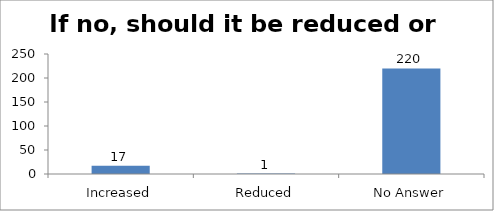
| Category | If no, should it be reduced or increased |
|---|---|
| Increased | 17 |
| Reduced | 1 |
| No Answer | 220 |